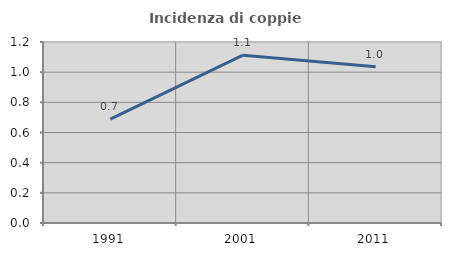
| Category | Incidenza di coppie miste |
|---|---|
| 1991.0 | 0.689 |
| 2001.0 | 1.112 |
| 2011.0 | 1.036 |